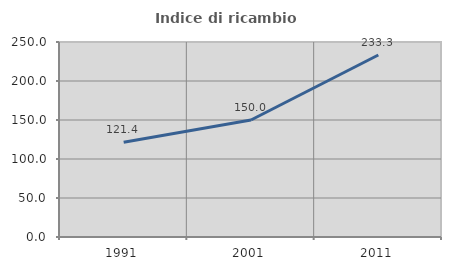
| Category | Indice di ricambio occupazionale  |
|---|---|
| 1991.0 | 121.429 |
| 2001.0 | 150 |
| 2011.0 | 233.333 |